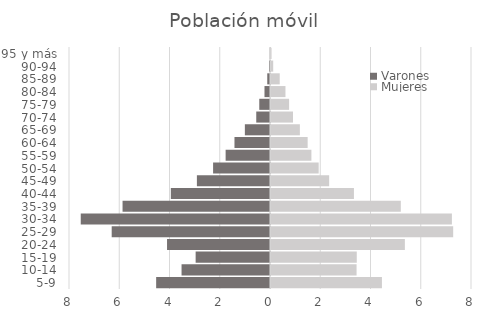
| Category | Varones | Mujeres |
|---|---|---|
| 5-9 | -4.531 | 4.415 |
| 10-14 | -3.52 | 3.406 |
| 15-19 | -2.959 | 3.414 |
| 20-24 | -4.098 | 5.328 |
| 25-29 | -6.301 | 7.251 |
| 30-34 | -7.532 | 7.2 |
| 35-39 | -5.868 | 5.166 |
| 40-44 | -3.947 | 3.301 |
| 45-49 | -2.91 | 2.315 |
| 50-54 | -2.265 | 1.897 |
| 55-59 | -1.766 | 1.608 |
| 60-64 | -1.414 | 1.459 |
| 65-69 | -1.001 | 1.149 |
| 70-74 | -0.547 | 0.875 |
| 75-79 | -0.427 | 0.72 |
| 80-84 | -0.219 | 0.576 |
| 85-89 | -0.109 | 0.347 |
| 90-94 | -0.041 | 0.088 |
| 95 y más | -0.007 | 0.021 |